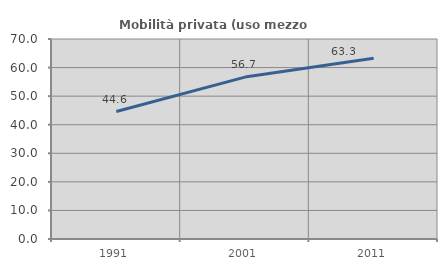
| Category | Mobilità privata (uso mezzo privato) |
|---|---|
| 1991.0 | 44.602 |
| 2001.0 | 56.667 |
| 2011.0 | 63.293 |